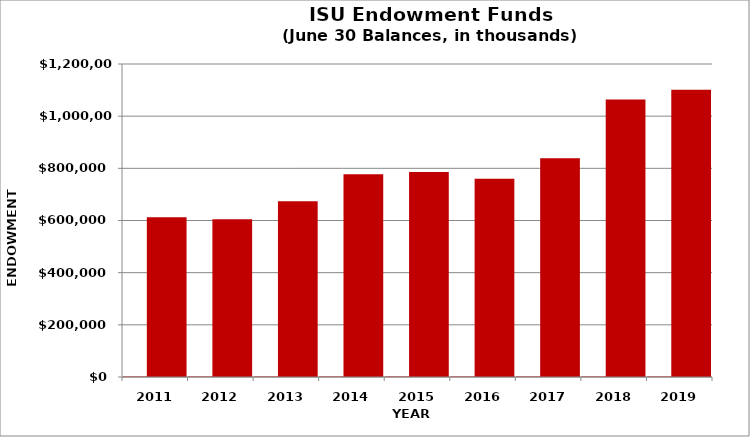
| Category | 2007 | Series 1 |
|---|---|---|
| 2011.0 | 2011 | 612283 |
| 2012.0 | 2012 | 604897 |
| 2013.0 | 2013 | 673515 |
| 2014.0 | 2014 | 777018 |
| 2015.0 | 2015 | 786205 |
| 2016.0 | 2016 | 760461 |
| 2017.0 | 2017 | 838871 |
| 2018.0 | 2018 | 1063772 |
| 2019.0 | 2019 | 1101709 |